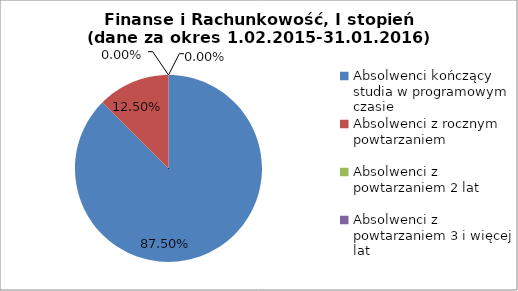
| Category | Series 0 |
|---|---|
| Absolwenci kończący studia w programowym czasie | 87.5 |
| Absolwenci z rocznym powtarzaniem | 12.5 |
| Absolwenci z powtarzaniem 2 lat | 0 |
| Absolwenci z powtarzaniem 3 i więcej lat | 0 |